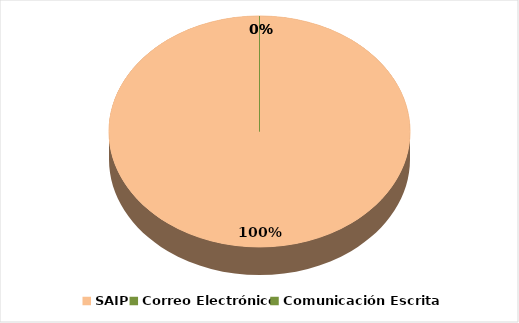
| Category | Series 0 |
|---|---|
| SAIP | 1 |
| Correo Electrónico | 0 |
| Comunicación Escrita | 0 |